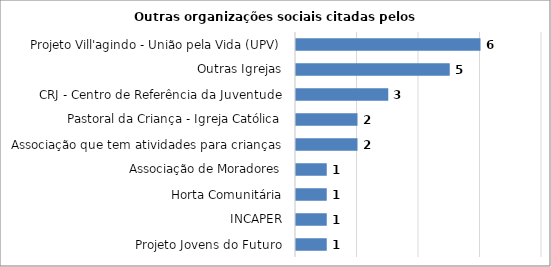
| Category | Series 0 |
|---|---|
| Projeto Jovens do Futuro | 1 |
| INCAPER | 1 |
| Horta Comunitária | 1 |
| Associação de Moradores | 1 |
| Associação que tem atividades para crianças | 2 |
| Pastoral da Criança - Igreja Católica | 2 |
| CRJ - Centro de Referência da Juventude | 3 |
| Outras Igrejas | 5 |
| Projeto Vill'agindo - União pela Vida (UPV) | 6 |